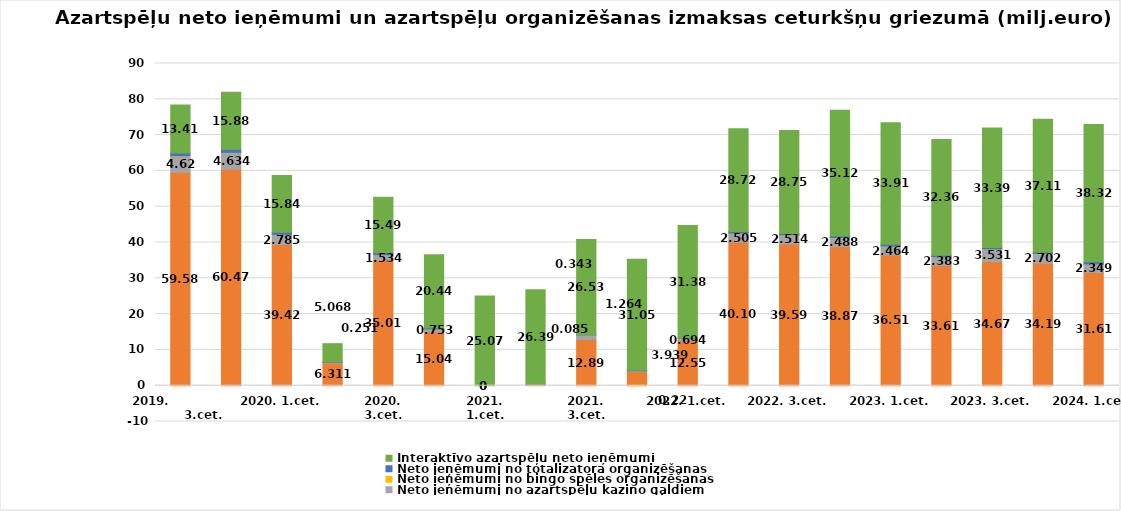
| Category | Neto ieņēmumi no azartspēļu automātiem | Neto ieņēmumi no azartspēļu kazino galdiem | Neto ieņēmumi no bingo spēles organizēšanas | Neto ieņēmumi no totalizatora organizēšanas | Interaktīvo azartspēļu neto ieņēmumi |
|---|---|---|---|---|---|
| 2019.                           3.cet. | 59.581 | 4.62 | 0.047 | 0.758 | 13.414 |
| 2019.                           4.cet. | 60.476 | 4.634 | 0.062 | 0.878 | 15.888 |
| 2020. 1.cet. | 39.421 | 2.785 | 0.056 | 0.573 | 15.848 |
| 2020.
2.cet. | 6.311 | 0.251 | 0 | 0.111 | 5.068 |
| 2020.
3.cet. | 35.011 | 1.534 | 0.041 | 0.573 | 15.493 |
| 2020.
4.cet. | 15.045 | 0.753 | 0.024 | 0.304 | 20.445 |
| 2021.
1.cet. | 0 | 0 | 0 | 0 | 25.07 |
| 2021.
2.cet. | 0.343 | 0.085 | 0 | 0.015 | 26.39 |
| 2021.
3.cet. | 12.896 | 1.264 | 0.007 | 0.108 | 26.538 |
| 2021. 4.cet. | 3.939 | 0.22 | -0.009 | 0.122 | 31.056 |
| 2022. 1.cet. | 12.556 | 0.694 | 0.003 | 0.131 | 31.382 |
| 2022. 2.cet. | 40.108 | 2.505 | 0.02 | 0.424 | 28.724 |
| 2022. 3.cet. | 39.593 | 2.514 | 0.024 | 0.389 | 28.759 |
| 2022. 4.cet. | 38.872 | 2.488 | 0.033 | 0.434 | 35.123 |
| 2023. 1.cet. | 36.516 | 2.464 | 0.03 | 0.527 | 33.915 |
| 2023. 2.cet. | 33.611 | 2.383 | 0.025 | 0.398 | 32.36 |
| 2023. 3.cet. | 34.676 | 3.531 | 0.022 | 0.38 | 33.394 |
| 2023. 4.cet. | 34.194 | 2.702 | 0.025 | 0.364 | 37.117 |
| 2024. 1.cet. | 31.611 | 2.349 | 0.025 | 0.623 | 38.329 |